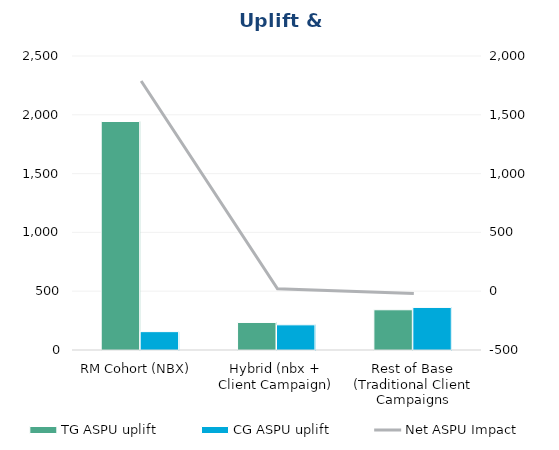
| Category | TG ASPU uplift  | CG ASPU uplift  |
|---|---|---|
| RM Cohort (NBX)  | 1943 | 156 |
| Hybrid (nbx + Client Campaign) | 234 | 214 |
| Rest of Base (Traditional Client Campaigns | 342 | 362 |